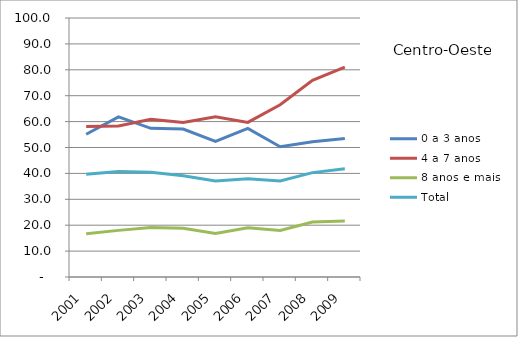
| Category | 0 a 3 anos | 4 a 7 anos | 8 anos e mais | Total |
|---|---|---|---|---|
| 2001.0 | 55.1 | 58.1 | 16.7 | 39.7 |
| 2002.0 | 61.8 | 58.3 | 18 | 40.7 |
| 2003.0 | 57.4 | 60.9 | 19.1 | 40.4 |
| 2004.0 | 57.1 | 59.7 | 18.8 | 39.1 |
| 2005.0 | 52.4 | 61.9 | 16.8 | 37.1 |
| 2006.0 | 57.4 | 59.7 | 19 | 37.9 |
| 2007.0 | 50.3 | 66.5 | 18 | 37.1 |
| 2008.0 | 52.2 | 75.9 | 21.2 | 40.3 |
| 2009.0 | 53.5 | 81 | 21.6 | 41.8 |